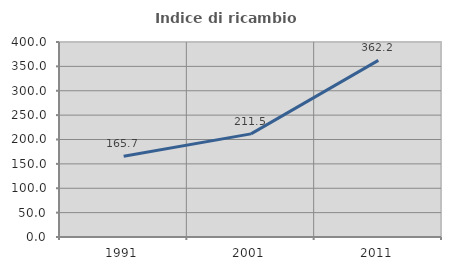
| Category | Indice di ricambio occupazionale  |
|---|---|
| 1991.0 | 165.693 |
| 2001.0 | 211.538 |
| 2011.0 | 362.245 |